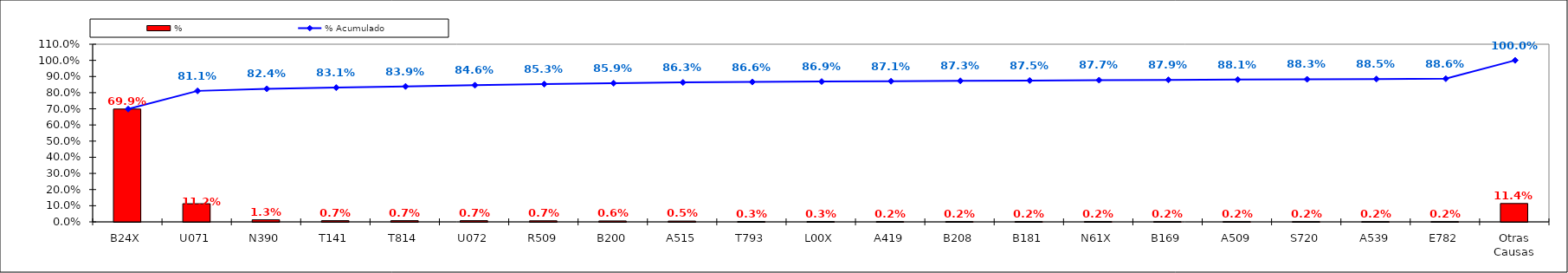
| Category | % |
|---|---|
| B24X | 0.699 |
| U071 | 0.112 |
| N390 | 0.013 |
| T141 | 0.007 |
| T814 | 0.007 |
| U072 | 0.007 |
| R509 | 0.007 |
| B200 | 0.006 |
| A515 | 0.005 |
| T793 | 0.003 |
| L00X | 0.003 |
| A419 | 0.002 |
| B208 | 0.002 |
| B181 | 0.002 |
| N61X | 0.002 |
| B169 | 0.002 |
| A509 | 0.002 |
| S720 | 0.002 |
| A539 | 0.002 |
| E782 | 0.002 |
| Otras Causas | 0.114 |